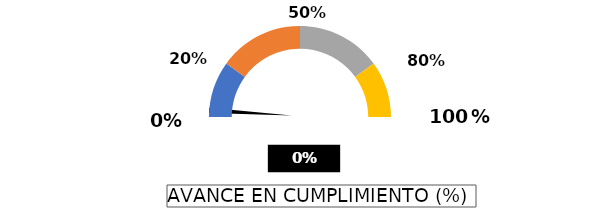
| Category | PUNTERO |
|---|---|
| 0 | -0.005 |
| 1 | 0.01 |
| 2 | 0.995 |